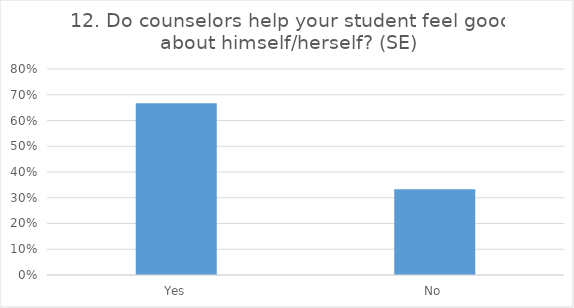
| Category | 12. Do counselors help your student feel good about himself/herself? (SE) |
|---|---|
| Yes | 0.667 |
| No | 0.333 |